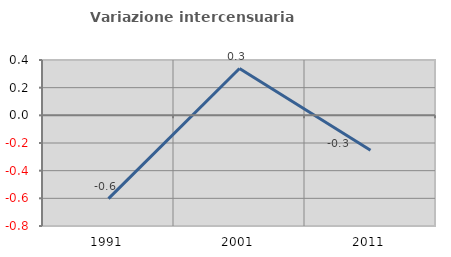
| Category | Variazione intercensuaria annua |
|---|---|
| 1991.0 | -0.603 |
| 2001.0 | 0.339 |
| 2011.0 | -0.252 |